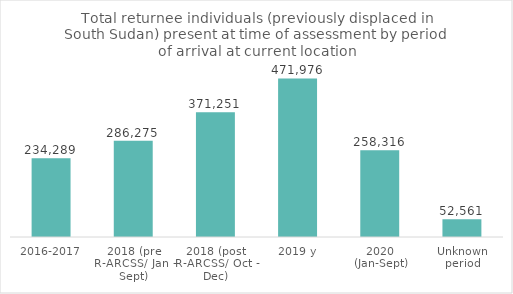
| Category | Total |
|---|---|
| 2016-2017 | 234289 |
| 2018 (pre R-ARCSS/ Jan - Sept) | 286275 |
| 2018 (post R-ARCSS/ Oct - Dec) | 371251 |
| 2019 y | 471976 |
| 2020 (Jan-Sept) | 258316 |
| Unknown period | 52561 |